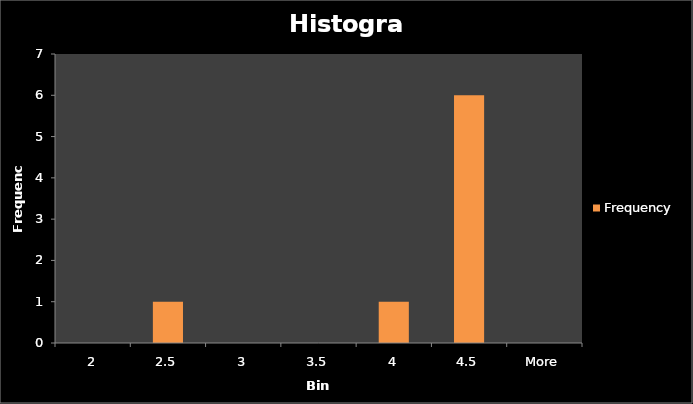
| Category | Frequency |
|---|---|
| 2 | 0 |
| 2.5 | 1 |
| 3 | 0 |
| 3.5 | 0 |
| 4 | 1 |
| 4.5 | 6 |
| More | 0 |